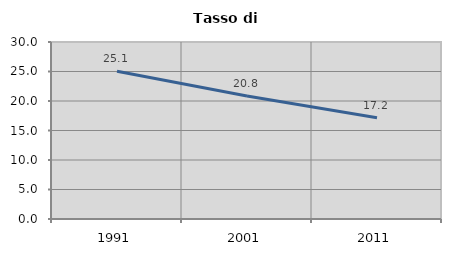
| Category | Tasso di disoccupazione   |
|---|---|
| 1991.0 | 25.059 |
| 2001.0 | 20.839 |
| 2011.0 | 17.163 |